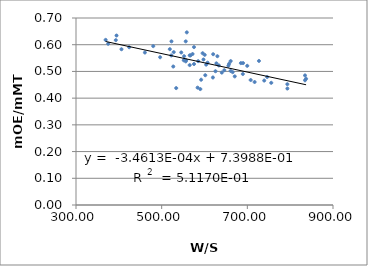
| Category | Series 0 |
|---|---|
| 655.7692307692307 | 0.521 |
| 684.931506849315 | 0.531 |
| 522.875816993464 | 0.612 |
| 600.490196078431 | 0.562 |
| 727.1241830065359 | 0.539 |
| 633.4343156155329 | 0.523 |
| 597.6315064720462 | 0.545 |
| 707.7939961443128 | 0.468 |
| 746.3508675296061 | 0.479 |
| 834.667276469243 | 0.467 |
| 834.667276469243 | 0.485 |
| 660.954712362301 | 0.502 |
| 533.9273112208892 | 0.438 |
| 556.2009250295795 | 0.613 |
| 601.8239392020266 | 0.486 |
| 575.4613356766256 | 0.528 |
| 620.2768014059753 | 0.564 |
| 690.0263620386643 | 0.531 |
| 575.4613356766256 | 0.591 |
| 522.3916532905297 | 0.56 |
| 556.9823434991974 | 0.542 |
| 627.7688603531301 | 0.53 |
| 665.7436399217221 | 0.497 |
| 739.412915851272 | 0.466 |
| 755.8666666666667 | 0.457 |
| 625.6410256410256 | 0.501 |
| 661.1066126855601 | 0.539 |
| 480.3318037416166 | 0.595 |
| 619.6258383339216 | 0.477 |
| 552.3791034239322 | 0.557 |
| 640.4412283798093 | 0.495 |
| 567.2510518934081 | 0.56 |
| 670.6334735857878 | 0.481 |
| 699.7896213183731 | 0.521 |
| 583.8911364472233 | 0.439 |
| 592.129459360059 | 0.469 |
| 406.18877492220815 | 0.583 |
| 527.0517371195009 | 0.518 |
| 556.2009250295795 | 0.538 |
| 585.350112939658 | 0.538 |
| 565.4496883348174 | 0.56 |
| 603.846838824577 | 0.525 |
| 646.3045414069456 | 0.505 |
| 565.4496883348174 | 0.524 |
| 630.0979519145147 | 0.557 |
| 519.0481370682622 | 0.583 |
| 716.9866739189557 | 0.46 |
| 837.179108881676 | 0.473 |
| 793.4548802946593 | 0.436 |
| 793.4548802946593 | 0.452 |
| 657.461897356143 | 0.529 |
| 590.2343051332498 | 0.434 |
| 551.5832482124616 | 0.542 |
| 689.4790602655771 | 0.49 |
| 369.20659858601726 | 0.618 |
| 496.4010920824026 | 0.553 |
| 607.1820175438596 | 0.533 |
| 558.7196308845794 | 0.646 |
| 528.111254851229 | 0.572 |
| 545.7179818887452 | 0.571 |
| 572.1216041397154 | 0.565 |
| 595.601552393273 | 0.568 |
| 394.6277961129446 | 0.634 |
| 424.14741474147417 | 0.591 |
| 375.1465416178195 | 0.603 |
| 392.94117647058823 | 0.617 |
| 460.85561497326205 | 0.571 |